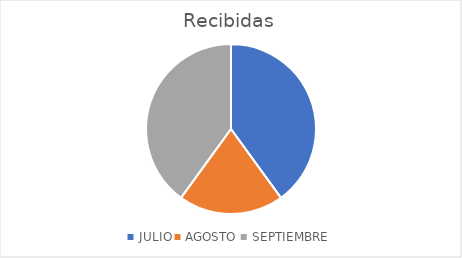
| Category | Recibidas |
|---|---|
| JULIO | 2 |
| AGOSTO | 1 |
| SEPTIEMBRE | 2 |